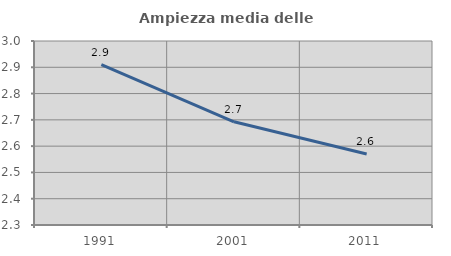
| Category | Ampiezza media delle famiglie |
|---|---|
| 1991.0 | 2.91 |
| 2001.0 | 2.693 |
| 2011.0 | 2.57 |